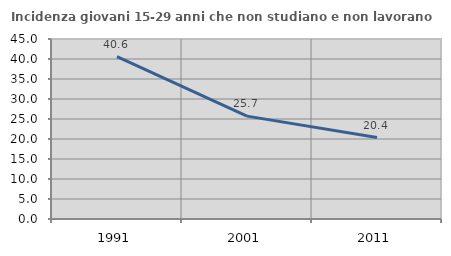
| Category | Incidenza giovani 15-29 anni che non studiano e non lavorano  |
|---|---|
| 1991.0 | 40.567 |
| 2001.0 | 25.714 |
| 2011.0 | 20.37 |